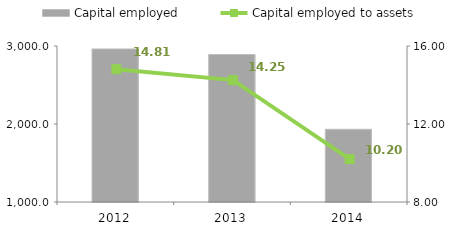
| Category | Capital employed |
|---|---|
| 2012.0 | 2962.3 |
| 2013.0 | 2890.9 |
| 2014.0 | 1932 |